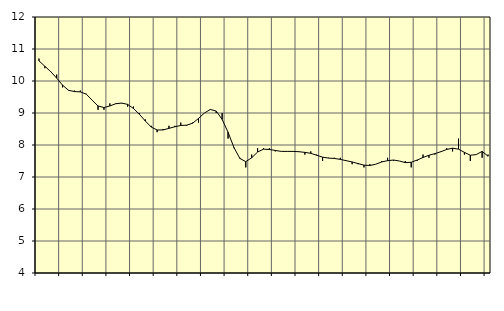
| Category | Piggar | Tillverkning av verkstadsvaror, SNI 25-30, 33 |
|---|---|---|
| nan | 10.7 | 10.63 |
| 1.0 | 10.4 | 10.46 |
| 1.0 | 10.3 | 10.29 |
| 1.0 | 10.2 | 10.09 |
| nan | 9.8 | 9.87 |
| 2.0 | 9.7 | 9.71 |
| 2.0 | 9.7 | 9.67 |
| 2.0 | 9.7 | 9.66 |
| nan | 9.6 | 9.59 |
| 3.0 | 9.4 | 9.4 |
| 3.0 | 9.1 | 9.22 |
| 3.0 | 9.1 | 9.17 |
| nan | 9.3 | 9.22 |
| 4.0 | 9.3 | 9.29 |
| 4.0 | 9.3 | 9.31 |
| 4.0 | 9.2 | 9.27 |
| nan | 9.2 | 9.14 |
| 5.0 | 9 | 8.96 |
| 5.0 | 8.8 | 8.75 |
| 5.0 | 8.6 | 8.56 |
| nan | 8.4 | 8.47 |
| 6.0 | 8.5 | 8.47 |
| 6.0 | 8.6 | 8.52 |
| 6.0 | 8.6 | 8.57 |
| nan | 8.7 | 8.61 |
| 7.0 | 8.6 | 8.62 |
| 7.0 | 8.7 | 8.68 |
| 7.0 | 8.7 | 8.83 |
| nan | 9 | 9 |
| 8.0 | 9.1 | 9.11 |
| 8.0 | 9 | 9.06 |
| 8.0 | 9 | 8.8 |
| nan | 8.2 | 8.4 |
| 9.0 | 7.9 | 7.92 |
| 9.0 | 7.6 | 7.58 |
| 9.0 | 7.3 | 7.48 |
| nan | 7.7 | 7.6 |
| 10.0 | 7.9 | 7.78 |
| 10.0 | 7.9 | 7.87 |
| 10.0 | 7.9 | 7.86 |
| nan | 7.8 | 7.83 |
| 11.0 | 7.8 | 7.8 |
| 11.0 | 7.8 | 7.8 |
| 11.0 | 7.8 | 7.8 |
| nan | 7.8 | 7.79 |
| 12.0 | 7.7 | 7.77 |
| 12.0 | 7.8 | 7.74 |
| 12.0 | 7.7 | 7.68 |
| nan | 7.5 | 7.62 |
| 13.0 | 7.6 | 7.59 |
| 13.0 | 7.6 | 7.58 |
| 13.0 | 7.6 | 7.55 |
| nan | 7.5 | 7.51 |
| 14.0 | 7.4 | 7.47 |
| 14.0 | 7.4 | 7.42 |
| 14.0 | 7.3 | 7.37 |
| nan | 7.4 | 7.36 |
| 15.0 | 7.4 | 7.4 |
| 15.0 | 7.5 | 7.47 |
| 15.0 | 7.6 | 7.51 |
| nan | 7.5 | 7.53 |
| 16.0 | 7.5 | 7.5 |
| 16.0 | 7.5 | 7.45 |
| 16.0 | 7.3 | 7.46 |
| nan | 7.5 | 7.53 |
| 17.0 | 7.7 | 7.61 |
| 17.0 | 7.6 | 7.68 |
| 17.0 | 7.7 | 7.73 |
| nan | 7.8 | 7.79 |
| 18.0 | 7.9 | 7.86 |
| 18.0 | 7.8 | 7.9 |
| 18.0 | 8.2 | 7.87 |
| nan | 7.7 | 7.77 |
| 19.0 | 7.5 | 7.68 |
| 19.0 | 7.7 | 7.7 |
| 19.0 | 7.6 | 7.8 |
| nan | 7.7 | 7.65 |